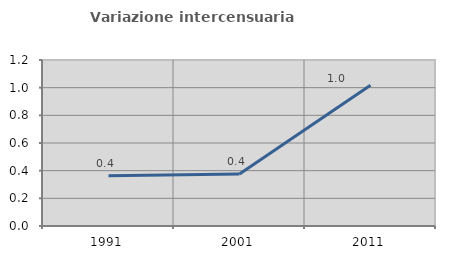
| Category | Variazione intercensuaria annua |
|---|---|
| 1991.0 | 0.363 |
| 2001.0 | 0.376 |
| 2011.0 | 1.018 |